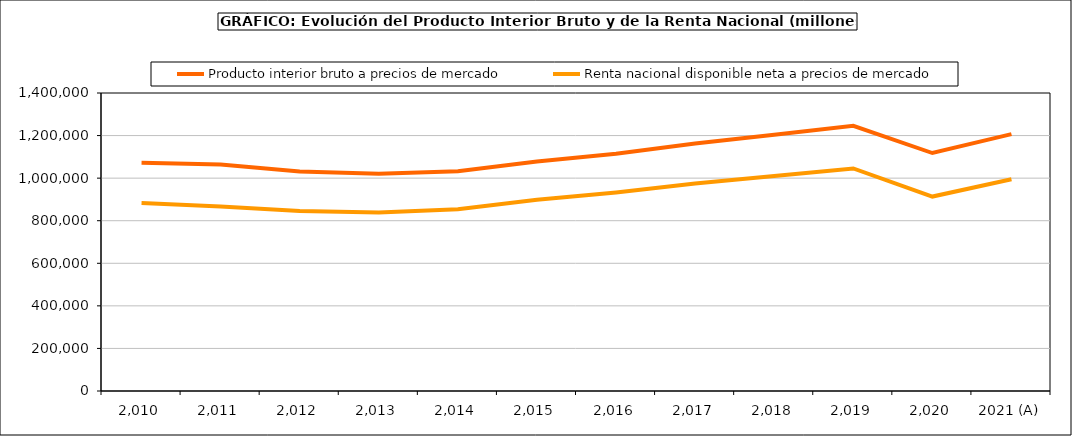
| Category | Producto interior bruto a precios de mercado | Renta nacional disponible neta a precios de mercado |
|---|---|---|
| 2.010 | 1072709 | 882934 |
| 2.011 | 1063763 | 867238 |
| 2.012 | 1031104 | 845978 |
| 2.013 | 1020677 | 838823 |
| 2.014 | 1032608 | 853672 |
| 2.015 | 1078092 | 898462 |
| 2.016 | 1114420 | 932732 |
| 2.017 | 1162492 | 974735 |
| 2.018 | 1203859 | 1010438 |
| 2.019 | 1245513 | 1045452 |
| 2.020 | 1117989 | 913519 |
| 2021 (A) | 1206842 | 994730 |